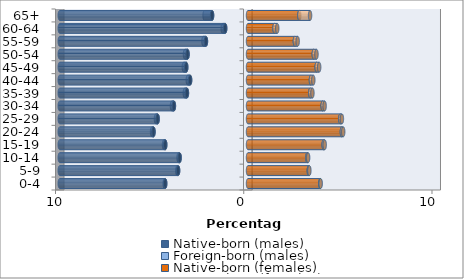
| Category | Native-born (males) | Foreign-born (males) | Native-born (females) | Foreign-born (females) |
|---|---|---|---|---|
| 0-4 | -4.398 | -0.028 | 3.838 | 0.02 |
| 5-9 | -3.713 | -0.042 | 3.229 | 0.031 |
| 10-14 | -3.632 | -0.056 | 3.15 | 0.045 |
| 15-19 | -4.396 | -0.066 | 4.018 | 0.057 |
| 20-24 | -5.019 | -0.077 | 4.987 | 0.071 |
| 25-29 | -4.801 | -0.09 | 4.901 | 0.088 |
| 30-34 | -3.935 | -0.105 | 3.966 | 0.105 |
| 35-39 | -3.243 | -0.113 | 3.308 | 0.115 |
| 40-44 | -3.075 | -0.124 | 3.342 | 0.128 |
| 45-49 | -3.28 | -0.129 | 3.647 | 0.134 |
| 50-54 | -3.211 | -0.136 | 3.494 | 0.144 |
| 55-59 | -2.233 | -0.134 | 2.489 | 0.15 |
| 60-64 | -1.212 | -0.133 | 1.407 | 0.148 |
| 65+ | -1.909 | -0.398 | 2.726 | 0.571 |